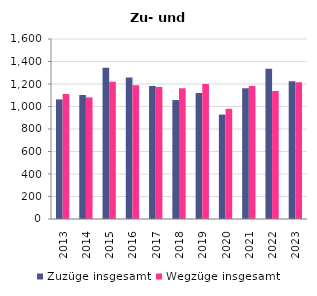
| Category | Zuzüge insgesamt | Wegzüge insgesamt |
|---|---|---|
| 2013.0 | 1063 | 1111 |
| 2014.0 | 1102 | 1081 |
| 2015.0 | 1345 | 1219 |
| 2016.0 | 1258 | 1189 |
| 2017.0 | 1183 | 1174 |
| 2018.0 | 1057 | 1162 |
| 2019.0 | 1120 | 1201 |
| 2020.0 | 928 | 979 |
| 2021.0 | 1162 | 1183 |
| 2022.0 | 1336 | 1138 |
| 2023.0 | 1225 | 1216 |